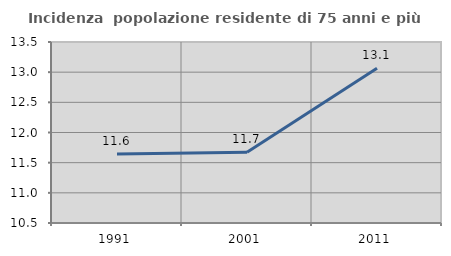
| Category | Incidenza  popolazione residente di 75 anni e più |
|---|---|
| 1991.0 | 11.643 |
| 2001.0 | 11.672 |
| 2011.0 | 13.063 |